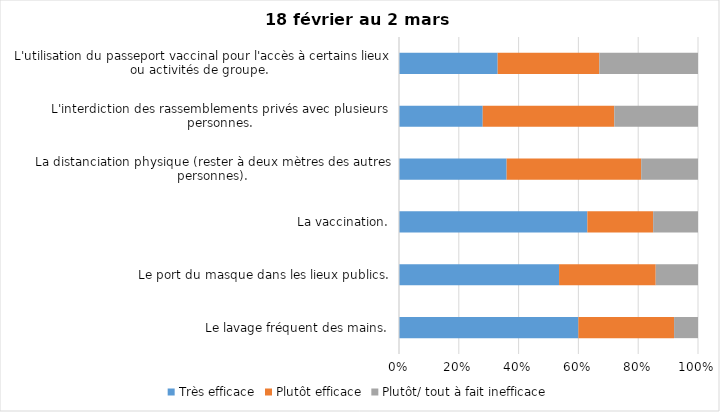
| Category | Très efficace | Plutôt efficace | Plutôt/ tout à fait inefficace |
|---|---|---|---|
| Le lavage fréquent des mains. | 60 | 32 | 8 |
| Le port du masque dans les lieux publics. | 53 | 32 | 14 |
| La vaccination. | 63 | 22 | 15 |
| La distanciation physique (rester à deux mètres des autres personnes). | 36 | 45 | 19 |
| L'interdiction des rassemblements privés avec plusieurs personnes. | 28 | 44 | 28 |
| L'utilisation du passeport vaccinal pour l'accès à certains lieux ou activités de groupe.  | 33 | 34 | 33 |